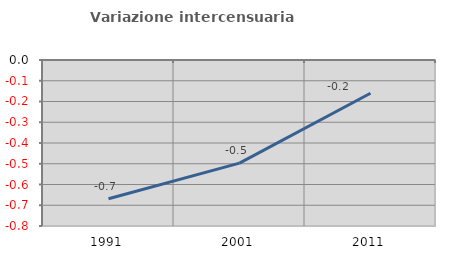
| Category | Variazione intercensuaria annua |
|---|---|
| 1991.0 | -0.669 |
| 2001.0 | -0.497 |
| 2011.0 | -0.16 |